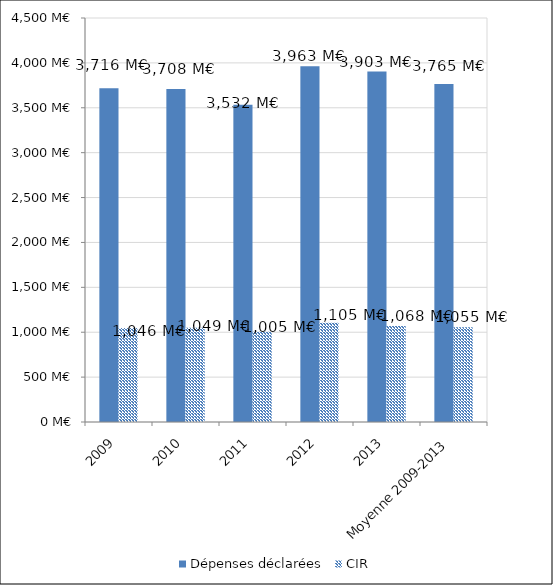
| Category | Dépenses déclarées | CIR |
|---|---|---|
| 2009 | 3716.344 | 1046.463 |
| 2010 | 3707.972 | 1049.465 |
| 2011 | 3532.467 | 1004.81 |
| 2012 | 3963.398 | 1105.01 |
| 2013 | 3903.102 | 1068.194 |
| Moyenne 2009-2013 | 3764.657 | 1054.788 |